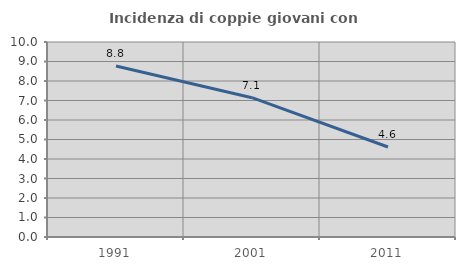
| Category | Incidenza di coppie giovani con figli |
|---|---|
| 1991.0 | 8.772 |
| 2001.0 | 7.143 |
| 2011.0 | 4.615 |